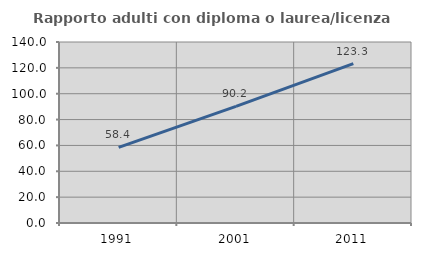
| Category | Rapporto adulti con diploma o laurea/licenza media  |
|---|---|
| 1991.0 | 58.44 |
| 2001.0 | 90.191 |
| 2011.0 | 123.292 |